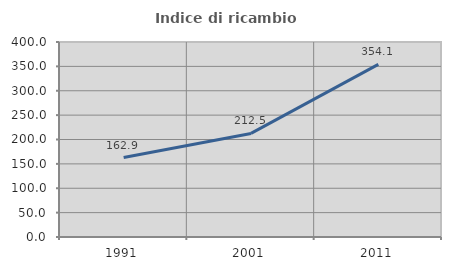
| Category | Indice di ricambio occupazionale  |
|---|---|
| 1991.0 | 162.924 |
| 2001.0 | 212.481 |
| 2011.0 | 354.125 |